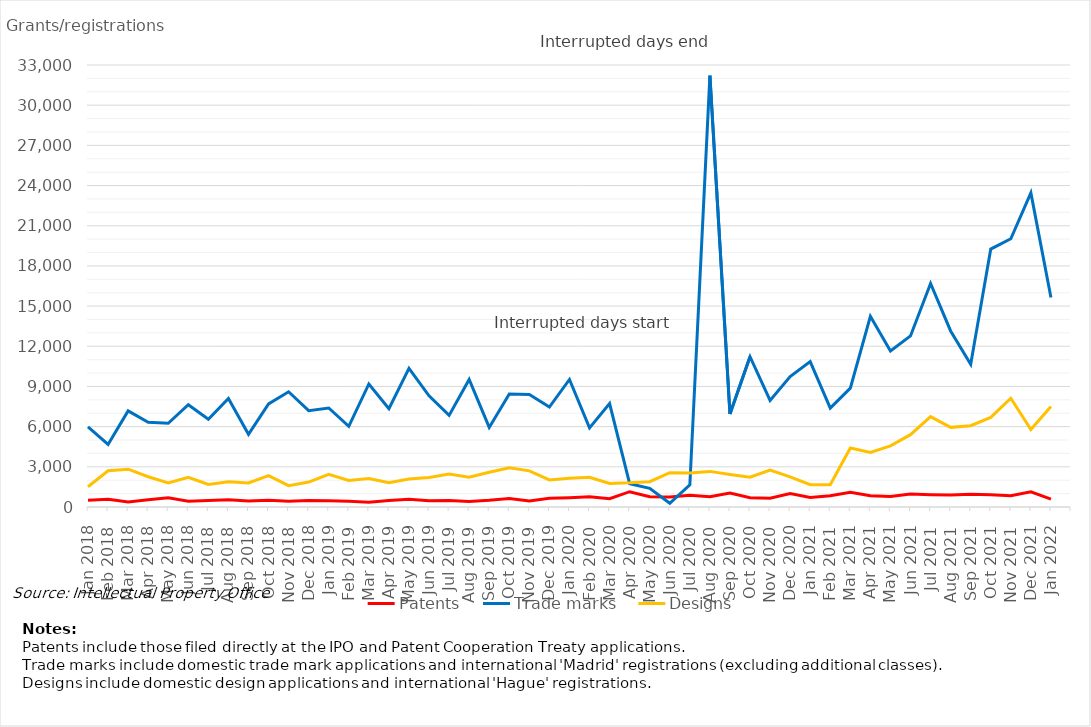
| Category | Patents | Trade marks | Designs |
|---|---|---|---|
| Jan 2018 | 495 | 5979 | 1512 |
| Feb 2018 | 574 | 4670 | 2704 |
| Mar 2018 | 370 | 7178 | 2825 |
| Apr 2018 | 543 | 6332 | 2259 |
| May 2018 | 690 | 6252 | 1789 |
| Jun 2018 | 424 | 7636 | 2222 |
| Jul 2018 | 486 | 6547 | 1678 |
| Aug 2018 | 536 | 8103 | 1878 |
| Sep 2018 | 450 | 5429 | 1795 |
| Oct 2018 | 498 | 7701 | 2348 |
| Nov 2018 | 432 | 8603 | 1592 |
| Dec 2018 | 484 | 7190 | 1859 |
| Jan 2019 | 475 | 7392 | 2444 |
| Feb 2019 | 426 | 6023 | 1987 |
| Mar 2019 | 363 | 9185 | 2125 |
| Apr 2019 | 488 | 7335 | 1810 |
| May 2019 | 573 | 10344 | 2096 |
| Jun 2019 | 471 | 8304 | 2202 |
| Jul 2019 | 489 | 6839 | 2464 |
| Aug 2019 | 420 | 9518 | 2218 |
| Sep 2019 | 500 | 5943 | 2596 |
| Oct 2019 | 634 | 8435 | 2926 |
| Nov 2019 | 455 | 8398 | 2700 |
| Dec 2019 | 654 | 7465 | 2021 |
| Jan 2020 | 696 | 9522 | 2145 |
| Feb 2020 | 756 | 5905 | 2220 |
| Mar 2020 | 622 | 7722 | 1757 |
| Apr 2020 | 1143 | 1742 | 1803 |
| May 2020 | 768 | 1397 | 1888 |
| Jun 2020 | 740 | 279 | 2564 |
| Jul 2020 | 878 | 1658 | 2539 |
| Aug 2020 | 771 | 32204 | 2659 |
| Sep 2020 | 1042 | 6944 | 2425 |
| Oct 2020 | 697 | 11218 | 2223 |
| Nov 2020 | 649 | 7954 | 2763 |
| Dec 2020 | 1010 | 9745 | 2252 |
| Jan 2021 | 708 | 10856 | 1665 |
| Feb 2021 | 838 | 7380 | 1660 |
| Mar 2021 | 1107 | 8877 | 4408 |
| Apr 2021 | 838 | 14233 | 4076 |
| May 2021 | 788 | 11653 | 4562 |
| Jun 2021 | 972 | 12772 | 5400 |
| Jul 2021 | 918 | 16692 | 6745 |
| Aug 2021 | 887 | 13144 | 5946 |
| Sep 2021 | 947 | 10649 | 6073 |
| Oct 2021 | 920 | 19254 | 6689 |
| Nov 2021 | 841 | 20027 | 8121 |
| Dec 2021 | 1131 | 23451 | 5788 |
| Jan 2022 | 585 | 15648 | 7503 |